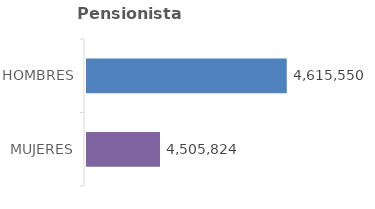
| Category | Series 0 | Series 1 |
|---|---|---|
| MUJERES | 4505824 |  |
| HOMBRES | 4615550 |  |